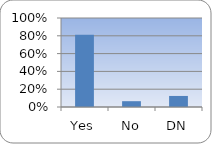
| Category | Series 0 |
|---|---|
| Yes | 0.811 |
| No | 0.065 |
| DN | 0.124 |